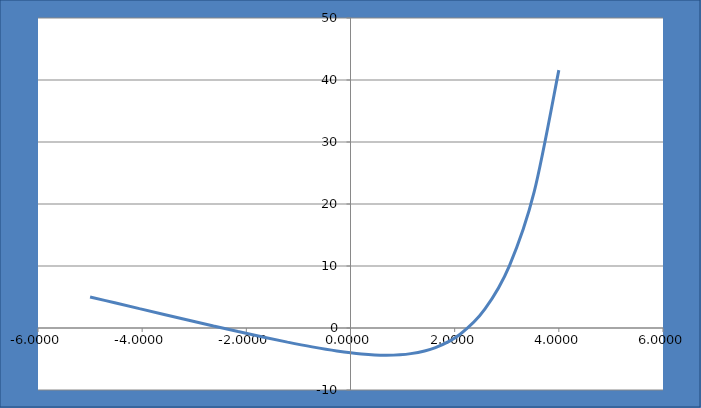
| Category | Series 0 |
|---|---|
| -5.0 | 5.007 |
| -4.526315789473684 | 4.063 |
| -4.052631578947368 | 3.123 |
| -3.578947368421052 | 2.186 |
| -3.1052631578947363 | 1.255 |
| -2.6315789473684204 | 0.335 |
| -2.1578947368421044 | -0.569 |
| -1.6842105263157887 | -1.446 |
| -1.210526315789473 | -2.281 |
| -0.7368421052631573 | -3.048 |
| -0.26315789473684154 | -3.705 |
| 0.21052631578947423 | -4.187 |
| 0.68421052631579 | -4.386 |
| 1.1578947368421058 | -4.133 |
| 1.6315789473684215 | -3.151 |
| 2.105263157894737 | -1.001 |
| 2.578947368421053 | 3.025 |
| 3.052631578947369 | 10.066 |
| 3.526315789473685 | 21.946 |
| 4.0 | 41.598 |